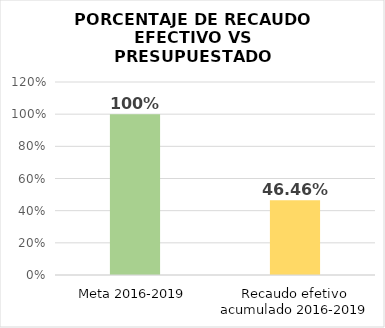
| Category | Series 0 |
|---|---|
| Meta 2016-2019 | 1 |
| Recaudo efetivo acumulado 2016-2019 | 0.465 |